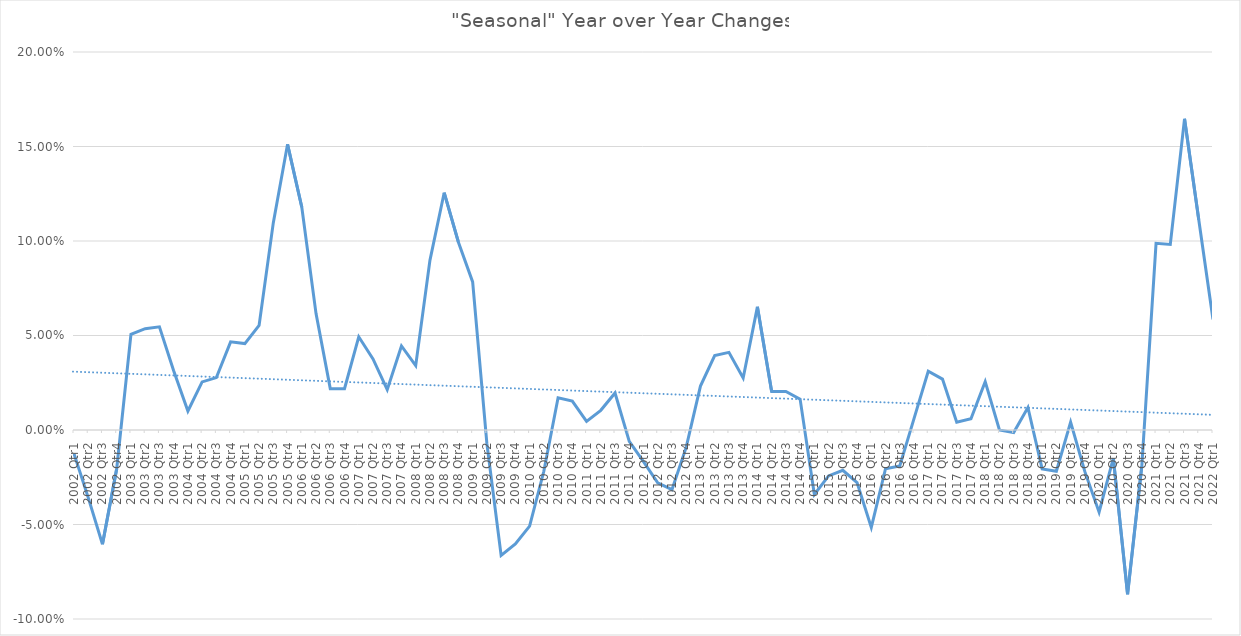
| Category | "Seasonal" Year over Year Changes |
|---|---|
| 2002 Qtr1 | -0.012 |
| 2002 Qtr2 | -0.036 |
| 2002 Qtr3 | -0.06 |
| 2002 Qtr4 | -0.02 |
| 2003 Qtr1 | 0.051 |
| 2003 Qtr2 | 0.054 |
| 2003 Qtr3 | 0.055 |
| 2003 Qtr4 | 0.031 |
| 2004 Qtr1 | 0.01 |
| 2004 Qtr2 | 0.025 |
| 2004 Qtr3 | 0.028 |
| 2004 Qtr4 | 0.047 |
| 2005 Qtr1 | 0.046 |
| 2005 Qtr2 | 0.055 |
| 2005 Qtr3 | 0.11 |
| 2005 Qtr4 | 0.151 |
| 2006 Qtr1 | 0.118 |
| 2006 Qtr2 | 0.062 |
| 2006 Qtr3 | 0.022 |
| 2006 Qtr4 | 0.022 |
| 2007 Qtr1 | 0.049 |
| 2007 Qtr2 | 0.038 |
| 2007 Qtr3 | 0.021 |
| 2007 Qtr4 | 0.044 |
| 2008 Qtr1 | 0.034 |
| 2008 Qtr2 | 0.09 |
| 2008 Qtr3 | 0.126 |
| 2008 Qtr4 | 0.099 |
| 2009 Qtr1 | 0.078 |
| 2009 Qtr2 | -0.007 |
| 2009 Qtr3 | -0.066 |
| 2009 Qtr4 | -0.06 |
| 2010 Qtr1 | -0.051 |
| 2010 Qtr2 | -0.022 |
| 2010 Qtr3 | 0.017 |
| 2010 Qtr4 | 0.015 |
| 2011 Qtr1 | 0.005 |
| 2011 Qtr2 | 0.01 |
| 2011 Qtr3 | 0.02 |
| 2011 Qtr4 | -0.006 |
| 2012 Qtr1 | -0.017 |
| 2012 Qtr2 | -0.028 |
| 2012 Qtr3 | -0.032 |
| 2012 Qtr4 | -0.009 |
| 2013 Qtr1 | 0.023 |
| 2013 Qtr2 | 0.039 |
| 2013 Qtr3 | 0.041 |
| 2013 Qtr4 | 0.027 |
| 2014 Qtr1 | 0.065 |
| 2014 Qtr2 | 0.02 |
| 2014 Qtr3 | 0.02 |
| 2014 Qtr4 | 0.016 |
| 2015 Qtr1 | -0.034 |
| 2015 Qtr2 | -0.024 |
| 2015 Qtr3 | -0.021 |
| 2015 Qtr4 | -0.028 |
| 2016 Qtr1 | -0.052 |
| 2016 Qtr2 | -0.02 |
| 2016 Qtr3 | -0.019 |
| 2016 Qtr4 | 0.006 |
| 2017 Qtr1 | 0.031 |
| 2017 Qtr2 | 0.027 |
| 2017 Qtr3 | 0.004 |
| 2017 Qtr4 | 0.006 |
| 2018 Qtr1 | 0.026 |
| 2018 Qtr2 | 0 |
| 2018 Qtr3 | -0.001 |
| 2018 Qtr4 | 0.012 |
| 2019 Qtr1 | -0.021 |
| 2019 Qtr2 | -0.022 |
| 2019 Qtr3 | 0.004 |
| 2019 Qtr4 | -0.022 |
| 2020 Qtr1 | -0.043 |
| 2020 Qtr2 | -0.015 |
| 2020 Qtr3 | -0.087 |
| 2020 Qtr4 | -0.019 |
| 2021 Qtr1 | 0.099 |
| 2021 Qtr2 | 0.098 |
| 2021 Qtr3 | 0.165 |
| 2021 Qtr4 | 0.111 |
| 2022 Qtr1 | 0.058 |